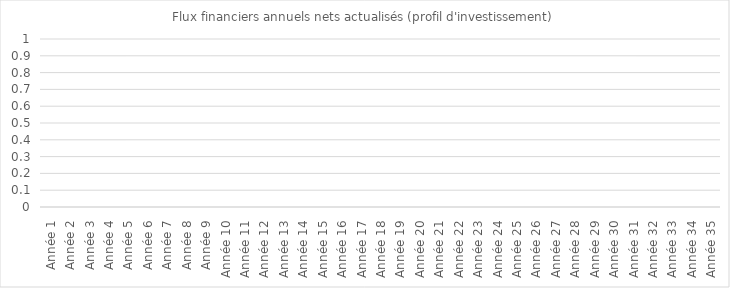
| Category | mois après le début | durée de l'intervention |
|---|---|---|
| Null | 0 | 0 |
| Null | 0 | 0 |
| Null | 0 | 0 |
| Null | 0 | 0 |
| Null | 0 | 0 |
| Null | 0 | 0 |